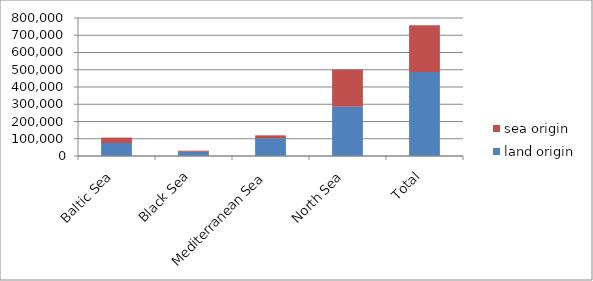
| Category | land origin | sea origin |
|---|---|---|
| Baltic Sea | 75354 | 31447.75 |
| Black Sea | 24230.5 | 6424 |
| Mediterranean Sea | 102481.5 | 17294 |
| North Sea | 285109 | 216327.25 |
| Total | 487175 | 271493 |